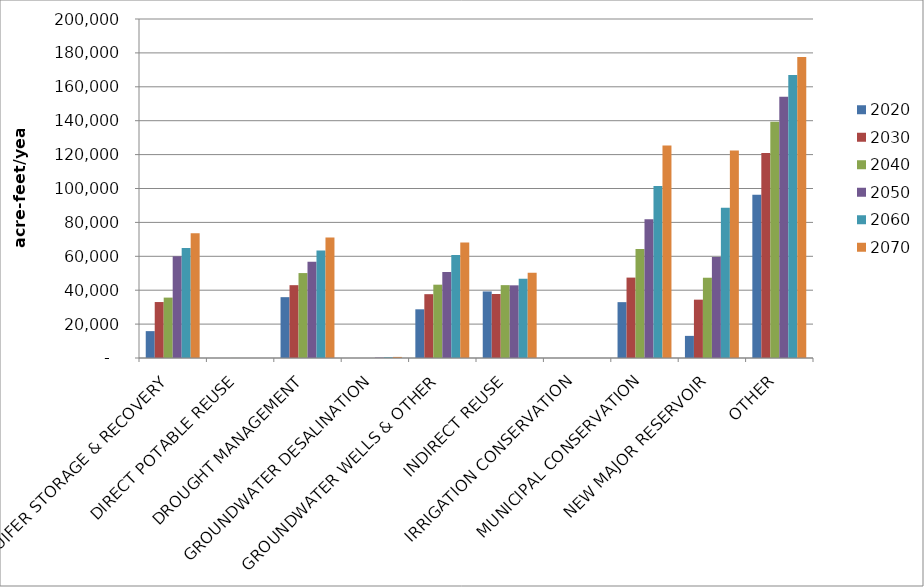
| Category | 2020 | 2030 | 2040 | 2050 | 2060 | 2070 |
|---|---|---|---|---|---|---|
| AQUIFER STORAGE & RECOVERY | 15855 | 33019 | 35633 | 59974 | 64834 | 73553 |
| DIRECT POTABLE REUSE | 0 | 0 | 35 | 0 | 0 | 0 |
| DROUGHT MANAGEMENT | 35894 | 42962 | 50106 | 56767 | 63451 | 71049 |
| GROUNDWATER DESALINATION | 0 | 0 | 0 | 251 | 440 | 641 |
| GROUNDWATER WELLS & OTHER | 28726 | 37658 | 43255 | 50758 | 60805 | 68207 |
| INDIRECT REUSE | 39258 | 37749 | 42990 | 42874 | 46759 | 50312 |
| IRRIGATION CONSERVATION | 5 | 8 | 11 | 11 | 11 | 11 |
| MUNICIPAL CONSERVATION | 32952 | 47436 | 64266 | 81877 | 101447 | 125367 |
| NEW MAJOR RESERVOIR | 13053 | 34421 | 47356 | 59636 | 88610 | 122418 |
| OTHER | 96307 | 120924 | 139332 | 154126 | 166924 | 177650 |